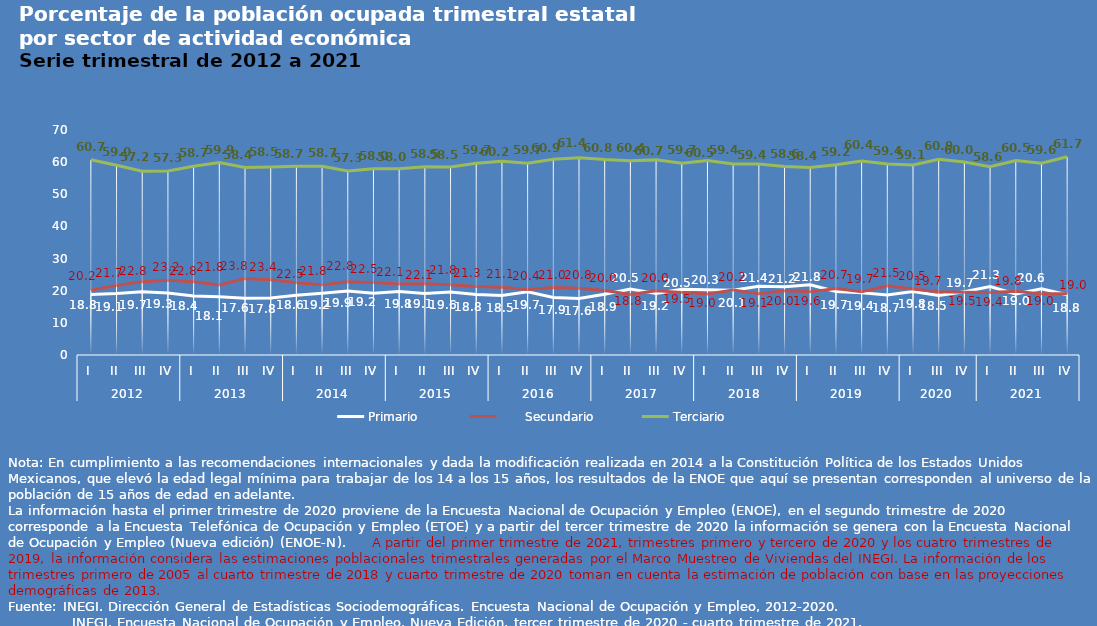
| Category | Primario |       Secundario | Terciario |
|---|---|---|---|
| 0 | 18.801 | 20.186 | 60.72 |
| 1 | 19.122 | 21.651 | 59.041 |
| 2 | 19.663 | 22.823 | 57.174 |
| 3 | 19.279 | 23.246 | 57.254 |
| 4 | 18.385 | 22.788 | 58.741 |
| 5 | 18.127 | 21.758 | 59.879 |
| 6 | 17.639 | 23.786 | 58.367 |
| 7 | 17.751 | 23.433 | 58.471 |
| 8 | 18.616 | 22.48 | 58.715 |
| 9 | 19.245 | 21.819 | 58.736 |
| 10 | 19.909 | 22.764 | 57.252 |
| 11 | 19.219 | 22.529 | 57.958 |
| 12 | 19.779 | 22.081 | 57.961 |
| 13 | 19.14 | 22.141 | 58.549 |
| 14 | 19.611 | 21.821 | 58.458 |
| 15 | 18.842 | 21.287 | 59.655 |
| 16 | 18.532 | 21.09 | 60.247 |
| 17 | 19.651 | 20.389 | 59.677 |
| 18 | 17.901 | 20.989 | 60.897 |
| 19 | 17.583 | 20.754 | 61.39 |
| 20 | 18.909 | 20.046 | 60.793 |
| 21 | 20.526 | 18.826 | 60.401 |
| 22 | 19.156 | 19.956 | 60.705 |
| 23 | 20.471 | 19.484 | 59.65 |
| 24 | 20.306 | 18.995 | 60.503 |
| 25 | 20.136 | 20.215 | 59.405 |
| 26 | 21.375 | 19.089 | 59.444 |
| 27 | 21.22 | 19.967 | 58.634 |
| 28 | 21.839 | 19.642 | 58.372 |
| 29 | 19.736 | 20.708 | 59.213 |
| 30 | 19.38 | 19.686 | 60.366 |
| 31 | 18.699 | 21.504 | 59.432 |
| 32 | 19.782 | 20.508 | 59.138 |
| 33 | 18.535 | 19.709 | 60.871 |
| 34 | 19.665 | 19.493 | 60.028 |
| 35 | 21.269 | 19.415 | 58.566 |
| 36 | 18.981 | 19.82 | 60.508 |
| 37 | 20.567 | 19.018 | 59.645 |
| 38 | 18.756 | 19.042 | 61.688 |